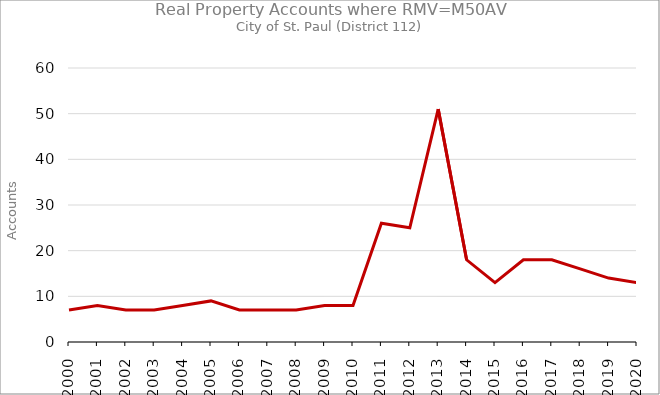
| Category | Series 0 |
|---|---|
| 2000.0 | 7 |
| 2001.0 | 8 |
| 2002.0 | 7 |
| 2003.0 | 7 |
| 2004.0 | 8 |
| 2005.0 | 9 |
| 2006.0 | 7 |
| 2007.0 | 7 |
| 2008.0 | 7 |
| 2009.0 | 8 |
| 2010.0 | 8 |
| 2011.0 | 26 |
| 2012.0 | 25 |
| 2013.0 | 51 |
| 2014.0 | 18 |
| 2015.0 | 13 |
| 2016.0 | 18 |
| 2017.0 | 18 |
| 2018.0 | 16 |
| 2019.0 | 14 |
| 2020.0 | 13 |